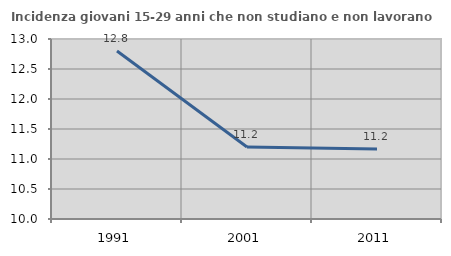
| Category | Incidenza giovani 15-29 anni che non studiano e non lavorano  |
|---|---|
| 1991.0 | 12.8 |
| 2001.0 | 11.2 |
| 2011.0 | 11.168 |